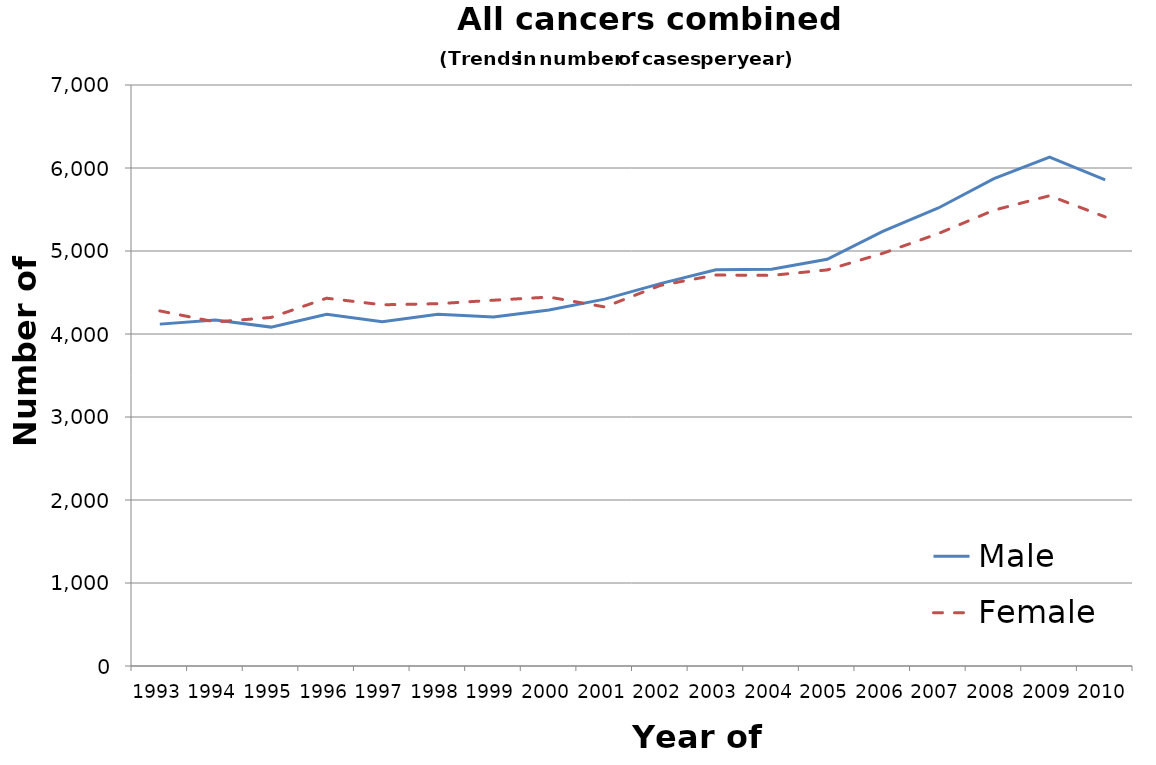
| Category | Male | Female |
|---|---|---|
| 1993.0 | 4119 | 4278 |
| 1994.0 | 4168 | 4145 |
| 1995.0 | 4083 | 4199 |
| 1996.0 | 4237 | 4431 |
| 1997.0 | 4149 | 4352 |
| 1998.0 | 4239 | 4365 |
| 1999.0 | 4204 | 4407 |
| 2000.0 | 4289 | 4445 |
| 2001.0 | 4420 | 4326 |
| 2002.0 | 4607 | 4585 |
| 2003.0 | 4773 | 4711 |
| 2004.0 | 4780 | 4706 |
| 2005.0 | 4900 | 4772 |
| 2006.0 | 5236 | 4972 |
| 2007.0 | 5518 | 5210 |
| 2008.0 | 5871 | 5492 |
| 2009.0 | 6132 | 5666 |
| 2010.0 | 5858 | 5411 |